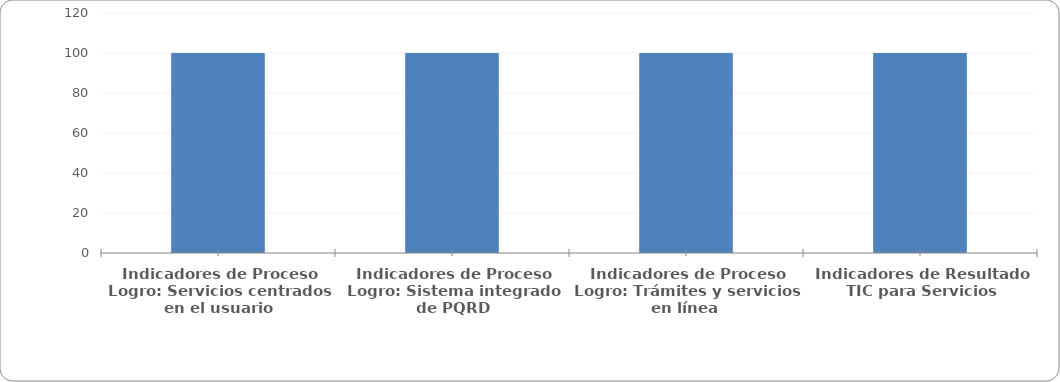
| Category | Series 0 |
|---|---|
| Indicadores de Proceso
Logro: Servicios centrados en el usuario | 100 |
| Indicadores de Proceso
Logro: Sistema integrado de PQRD | 100 |
| Indicadores de Proceso
Logro: Trámites y servicios en línea  | 100 |
| Indicadores de Resultado
TIC para Servicios | 100 |